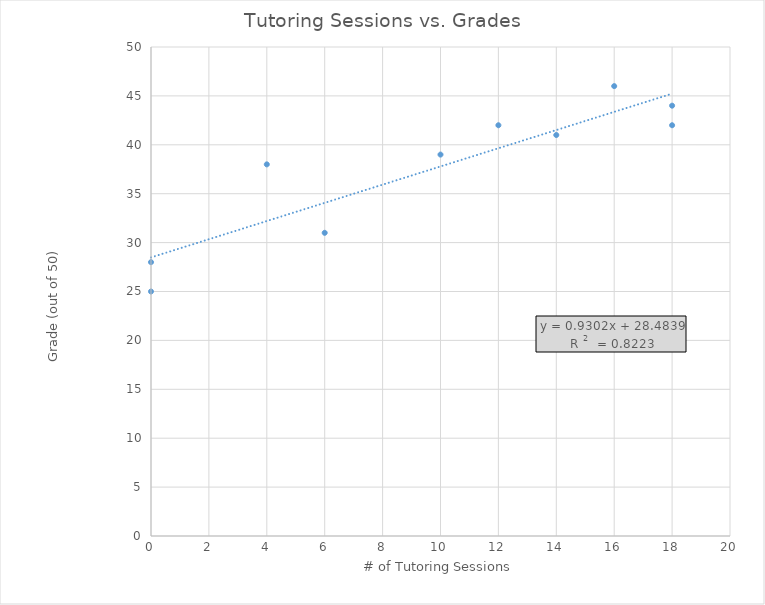
| Category | Y - Exam Grade (out of 50) |
|---|---|
| 18.0 | 42 |
| 6.0 | 31 |
| 16.0 | 46 |
| 14.0 | 41 |
| 0.0 | 25 |
| 4.0 | 38 |
| 0.0 | 28 |
| 10.0 | 39 |
| 12.0 | 42 |
| 18.0 | 44 |